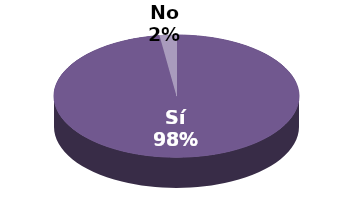
| Category | Series 1 |
|---|---|
| Sí | 44 |
| No | 1 |